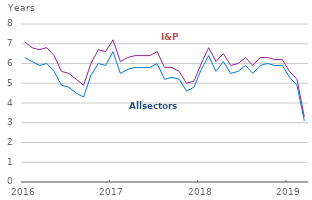
| Category | All sectors | I&P |
|---|---|---|
| 2016-01-01 | 6.3 | 7.1 |
| 2016-02-01 | 6.1 | 6.8 |
| 2016-03-01 | 5.9 | 6.7 |
| 2016-04-01 | 6 | 6.8 |
| 2016-05-01 | 5.6 | 6.4 |
| 2016-06-01 | 4.9 | 5.6 |
| 2016-07-01 | 4.8 | 5.5 |
| 2016-08-01 | 4.5 | 5.2 |
| 2016-09-01 | 4.3 | 4.9 |
| 2016-10-01 | 5.4 | 6 |
| 2016-11-01 | 6 | 6.7 |
| 2016-12-01 | 5.9 | 6.6 |
| 2017-01-01 | 6.6 | 7.2 |
| 2017-02-01 | 5.5 | 6.1 |
| 2017-03-01 | 5.7 | 6.3 |
| 2017-04-01 | 5.8 | 6.4 |
| 2017-05-01 | 5.8 | 6.4 |
| 2017-06-01 | 5.8 | 6.4 |
| 2017-07-01 | 6 | 6.6 |
| 2017-08-01 | 5.2 | 5.8 |
| 2017-09-01 | 5.3 | 5.8 |
| 2017-10-01 | 5.2 | 5.6 |
| 2017-11-01 | 4.6 | 5 |
| 2017-12-01 | 4.8 | 5.1 |
| 2018-01-01 | 5.7 | 6 |
| 2018-02-01 | 6.4 | 6.8 |
| 2018-03-01 | 5.6 | 6.1 |
| 2018-04-01 | 6.1 | 6.5 |
| 2018-05-01 | 5.5 | 5.9 |
| 2018-06-01 | 5.6 | 6 |
| 2018-07-01 | 5.9 | 6.3 |
| 2018-08-01 | 5.5 | 5.9 |
| 2018-09-01 | 5.9 | 6.3 |
| 2018-10-01 | 6 | 6.3 |
| 2018-11-01 | 5.9 | 6.2 |
| 2018-12-01 | 5.9 | 6.2 |
| 2019-01-01 | 5.3 | 5.6 |
| 2019-02-01 | 4.9 | 5.2 |
| 2019-03-01 | 3.1 | 3.3 |